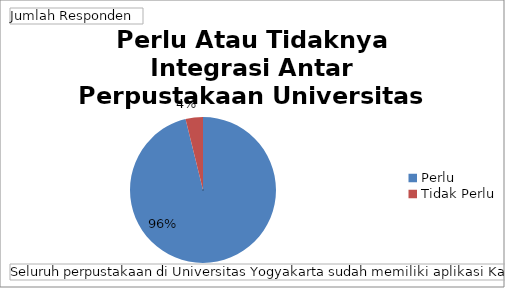
| Category | Total |
|---|---|
| Perlu | 75 |
| Tidak Perlu | 3 |